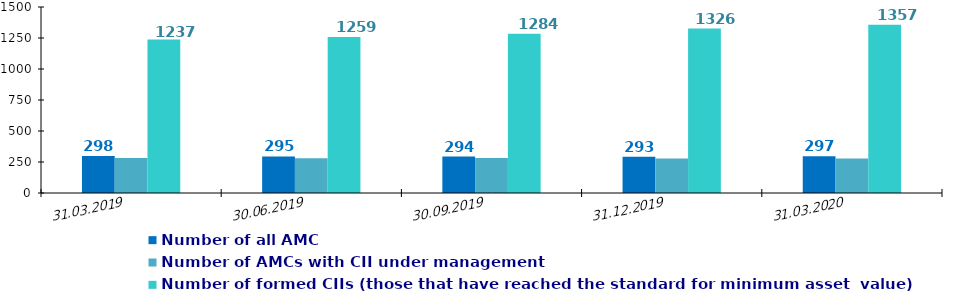
| Category | Number of all AMC    | Number of AMCs with CII under management | Number of CII under management (registered ones) | Number of formed CIIs (those that have reached the standard for minimum asset  value) |
|---|---|---|---|---|
| 31.03.2019 | 298 | 283 |  | 1237 |
| 30.06.2019 | 295 | 280 |  | 1259 |
| 30.09.2019 | 294 | 282 |  | 1284 |
| 31.12.2019 | 293 | 278 |  | 1326 |
| 31.03.2020 | 297 | 279 |  | 1357 |